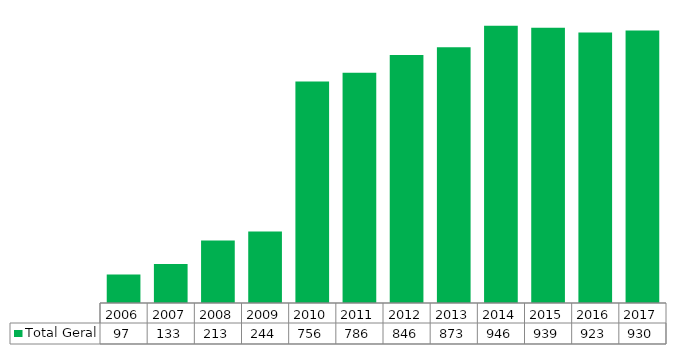
| Category | Total Geral |
|---|---|
| 2006.0 | 97 |
| 2007.0 | 133 |
| 2008.0 | 213 |
| 2009.0 | 244 |
| 2010.0 | 756 |
| 2011.0 | 786 |
| 2012.0 | 846 |
| 2013.0 | 873 |
| 2014.0 | 946 |
| 2015.0 | 939 |
| 2016.0 | 923 |
| 2017.0 | 930 |